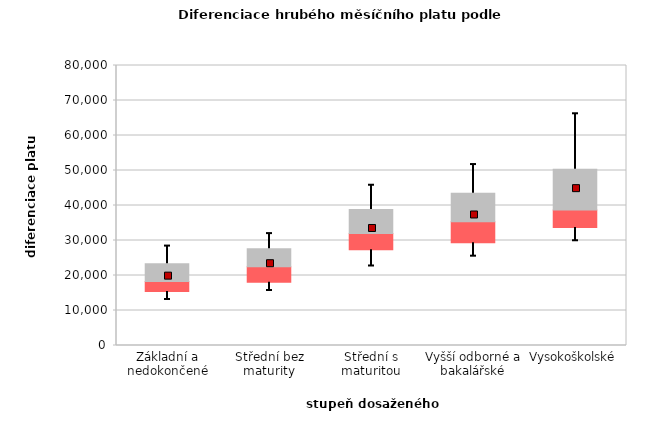
| Category | 0,25 | 0,5 | 0,75 |
|---|---|---|---|
| Základní a nedokončené | 15426.096 | 2840.904 | 5090.385 |
| Střední bez maturity | 18064.232 | 4416.808 | 5158.131 |
| Střední s maturitou | 27356.646 | 4648.286 | 6838.592 |
| Vyšší odborné a bakalářské | 29355.637 | 5999.405 | 8136.816 |
| Vysokoškolské | 33710.648 | 4987.986 | 11626.081 |